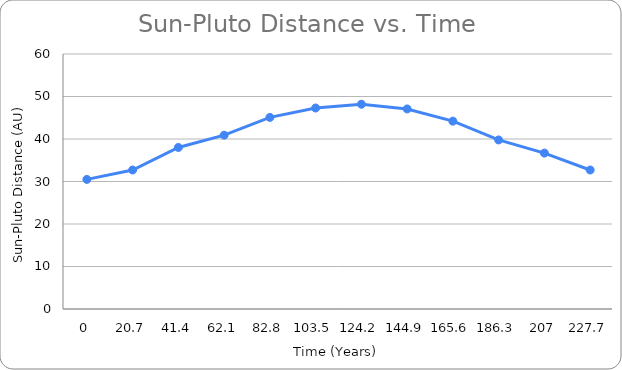
| Category | Series 0 |
|---|---|
| 0.0 | 30.498 |
| 20.7 | 32.708 |
| 41.4 | 38.012 |
| 62.099999999999994 | 40.9 |
| 82.8 | 45.084 |
| 103.5 | 47.294 |
| 124.19999999999999 | 48.18 |
| 144.9 | 47.073 |
| 165.6 | 44.2 |
| 186.29999999999998 | 39.78 |
| 207.0 | 36.686 |
| 227.7 | 32.708 |